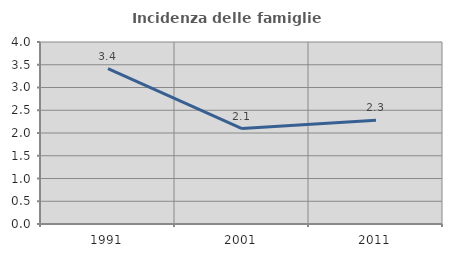
| Category | Incidenza delle famiglie numerose |
|---|---|
| 1991.0 | 3.417 |
| 2001.0 | 2.097 |
| 2011.0 | 2.279 |